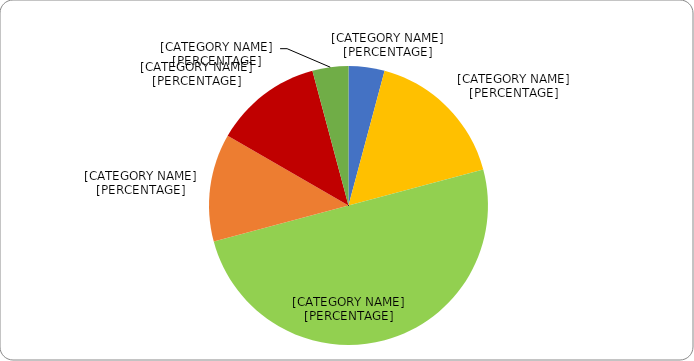
| Category | Series 0 |
|---|---|
| UN Agency | 1 |
| NGO - International | 4 |
| NGO - National | 12 |
| Private Actor | 3 |
| Government - National level | 3 |
| University/Academia | 1 |